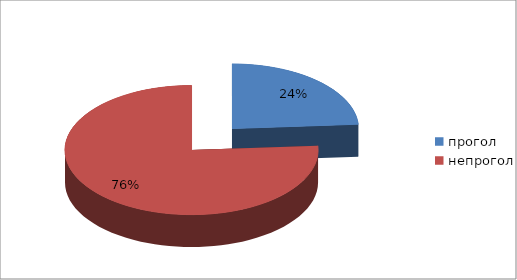
| Category | Series 0 |
|---|---|
| прогол | 45 |
| непрогол | 143 |